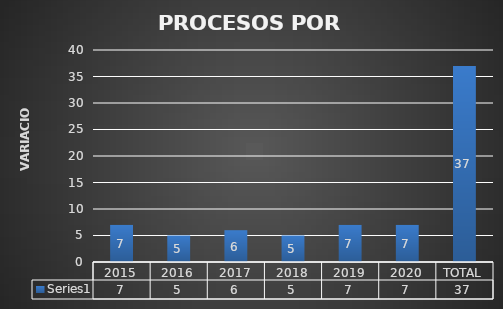
| Category | Series 0 |
|---|---|
| 2015 | 7 |
| 2016 | 5 |
| 2017 | 6 |
| 2018 | 5 |
| 2019 | 7 |
| 2020 | 7 |
| TOTAL | 37 |